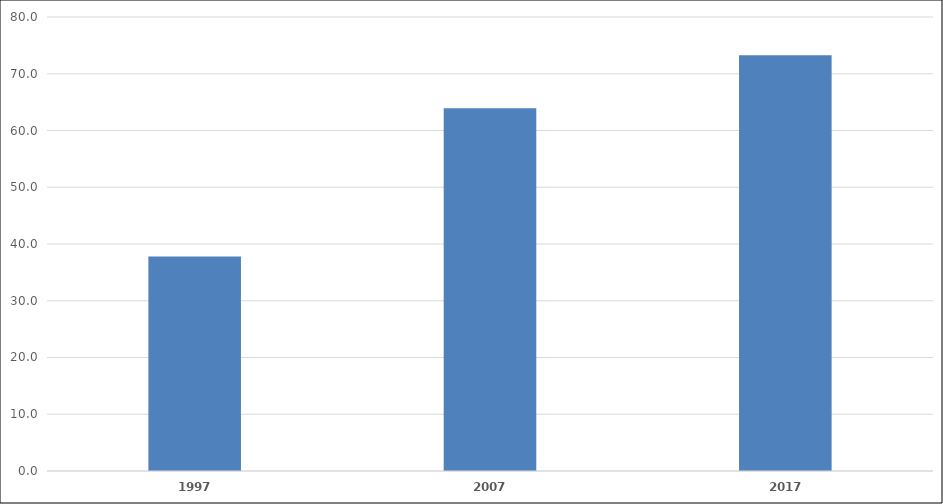
| Category | Series 0 |
|---|---|
| 1997.0 | 37.812 |
| 2007.0 | 63.9 |
| 2017.0 | 73.275 |